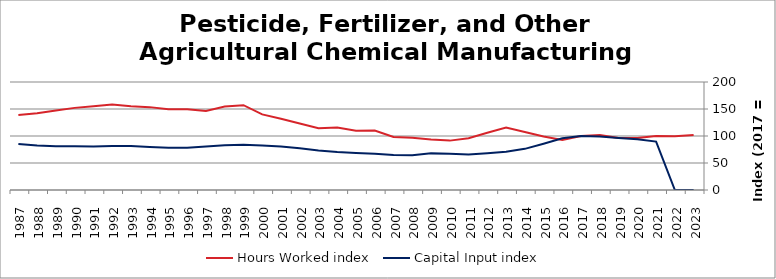
| Category | Hours Worked index | Capital Input index |
|---|---|---|
| 2023.0 | 102.073 | 0 |
| 2022.0 | 99.604 | 0 |
| 2021.0 | 100.132 | 89.628 |
| 2020.0 | 96.438 | 94.104 |
| 2019.0 | 96.306 | 96.345 |
| 2018.0 | 101.649 | 99.15 |
| 2017.0 | 100 | 100 |
| 2016.0 | 92.48 | 95.728 |
| 2015.0 | 98.967 | 85.646 |
| 2014.0 | 107.404 | 76.183 |
| 2013.0 | 115.56 | 70.944 |
| 2012.0 | 106.069 | 68.02 |
| 2011.0 | 95.904 | 65.796 |
| 2010.0 | 91.447 | 66.929 |
| 2009.0 | 93.536 | 67.823 |
| 2008.0 | 96.768 | 64.306 |
| 2007.0 | 98.285 | 64.873 |
| 2006.0 | 110.285 | 67.113 |
| 2005.0 | 109.784 | 68.741 |
| 2004.0 | 115.605 | 70.172 |
| 2003.0 | 114.224 | 73.252 |
| 2002.0 | 123.135 | 77.19 |
| 2001.0 | 131.904 | 80.469 |
| 2000.0 | 140.009 | 82.591 |
| 1999.0 | 157.071 | 83.706 |
| 1998.0 | 154.464 | 82.714 |
| 1997.0 | 146.453 | 80.393 |
| 1996.0 | 149.637 | 78.033 |
| 1995.0 | 149.757 | 78.074 |
| 1994.0 | 153.469 | 79.549 |
| 1993.0 | 154.89 | 81.498 |
| 1992.0 | 158.27 | 81.385 |
| 1991.0 | 154.984 | 80.605 |
| 1990.0 | 152.085 | 80.851 |
| 1989.0 | 147.246 | 80.93 |
| 1988.0 | 142.213 | 82.317 |
| 1987.0 | 139.083 | 85.355 |